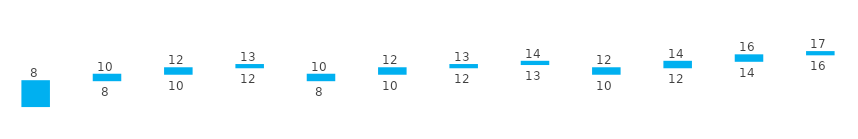
| Category | Series 0 | Series 1 | Series 2 |
|---|---|---|---|
| <2 | 0 | 8 | 8 |
| 2>&<4 | 8 | 2 | 10 |
| 4>&<10 | 10 | 2 | 12 |
| >10 | 12 | 1 | 13 |
| <2 | 8 | 2 | 10 |
| 2>&<4 | 10 | 2 | 12 |
| 4>&<10 | 12 | 1 | 13 |
| >10 | 13 | 1 | 14 |
| <2 | 10 | 2 | 12 |
| 2>&<4 | 12 | 2 | 14 |
| 4>&<10 | 14 | 2 | 16 |
| >10 | 16 | 1 | 17 |